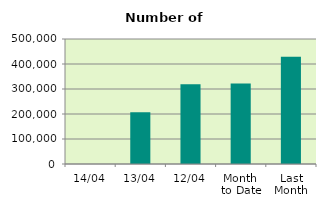
| Category | Series 0 |
|---|---|
| 14/04 | 0 |
| 13/04 | 207138 |
| 12/04 | 319232 |
| Month 
to Date | 321703.778 |
| Last
Month | 428970.609 |